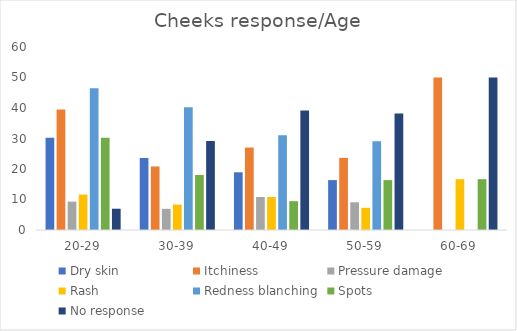
| Category | Dry skin | Itchiness | Pressure damage | Rash | Redness blanching | Spots | No response |
|---|---|---|---|---|---|---|---|
| 20-29 | 30.233 | 39.535 | 9.302 | 11.628 | 46.512 | 30.233 | 6.977 |
| 30-39 | 23.611 | 20.833 | 6.944 | 8.333 | 40.278 | 18.056 | 29.167 |
| 40-49 | 18.919 | 27.027 | 10.811 | 10.811 | 31.081 | 9.459 | 39.189 |
| 50-59 | 16.364 | 23.636 | 9.091 | 7.273 | 29.091 | 16.364 | 38.182 |
| 60-69 | 0 | 50 | 0 | 16.667 | 0 | 16.667 | 50 |